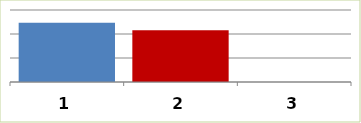
| Category | Series 0 |
|---|---|
| 0 | 1234285924 |
| 1 | 1075828141 |
| 2 | 0 |